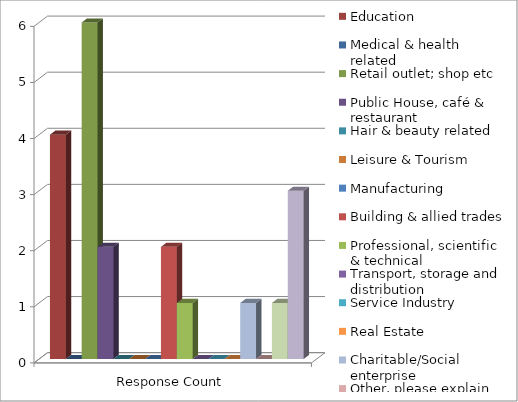
| Category | Education | Medical & health related | Retail outlet; shop etc | Public House, café & restaurant | Hair & beauty related | Leisure & Tourism | Manufacturing | Building & allied trades | Professional, scientific & technical | Transport, storage and distribution | Service Industry | Real Estate | Charitable/Social enterprise | Other, please explain | Other (please specify) |
|---|---|---|---|---|---|---|---|---|---|---|---|---|---|---|---|
| Response Count | 4 | 0 | 6 | 2 | 0 | 0 | 0 | 2 | 1 | 0 | 0 | 0 | 1 | 0 | 3 |